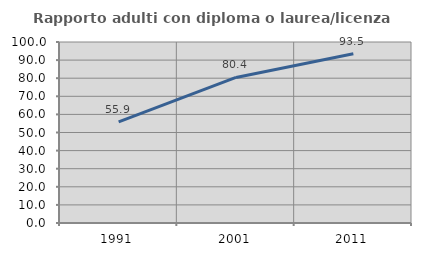
| Category | Rapporto adulti con diploma o laurea/licenza media  |
|---|---|
| 1991.0 | 55.921 |
| 2001.0 | 80.426 |
| 2011.0 | 93.548 |